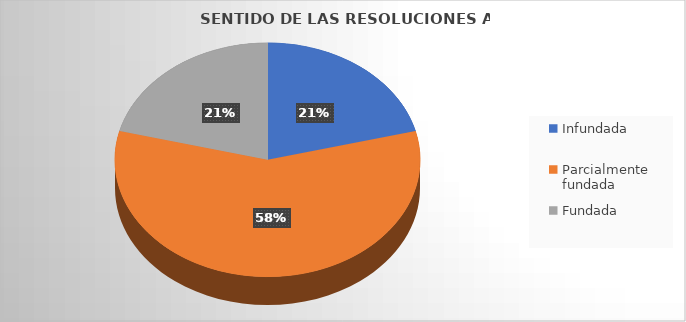
| Category | Series 0 |
|---|---|
| Infundada | 4 |
| Parcialmente fundada | 11 |
| Fundada | 4 |